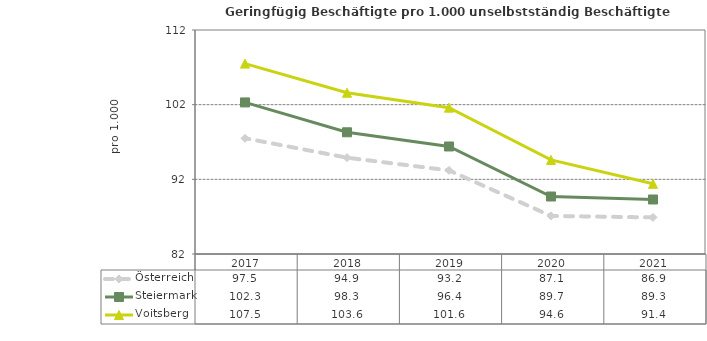
| Category | Österreich | Steiermark | Voitsberg |
|---|---|---|---|
| 2021.0 | 86.9 | 89.3 | 91.4 |
| 2020.0 | 87.1 | 89.7 | 94.6 |
| 2019.0 | 93.2 | 96.4 | 101.6 |
| 2018.0 | 94.9 | 98.3 | 103.6 |
| 2017.0 | 97.5 | 102.3 | 107.5 |